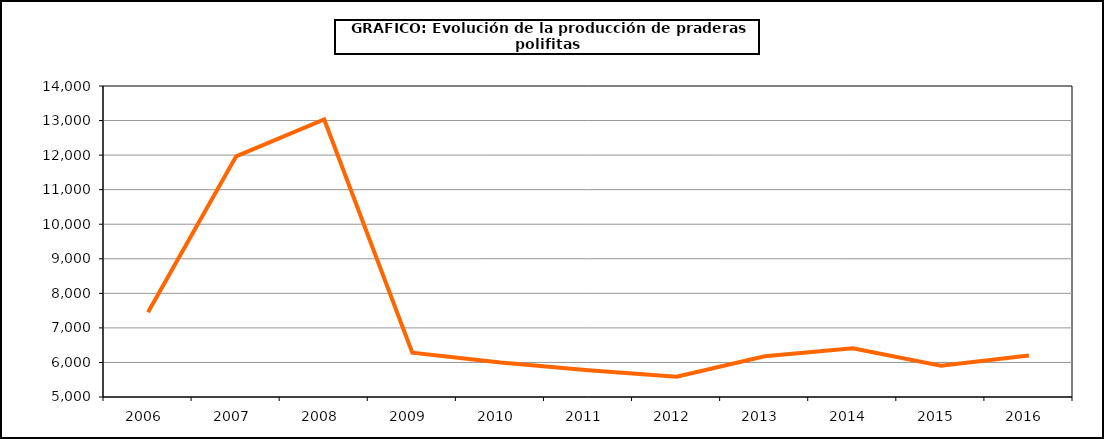
| Category | Producción |
|---|---|
| 2006.0 | 7451.635 |
| 2007.0 | 11965.253 |
| 2008.0 | 13031.127 |
| 2009.0 | 6281.816 |
| 2010.0 | 5997.652 |
| 2011.0 | 5773.366 |
| 2012.0 | 5584.28 |
| 2013.0 | 6180.164 |
| 2014.0 | 6413.135 |
| 2015.0 | 5907.876 |
| 2016.0 | 6204.083 |